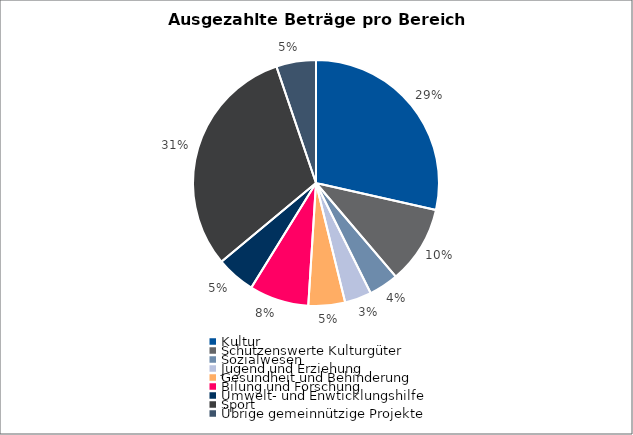
| Category | Series 0 |
|---|---|
| Kultur | 12939000 |
| Schützenswerte Kulturgüter | 4643000 |
| Sozialwesen | 1772000 |
| Jugend und Erziehung | 1595000 |
| Gesundheit und Behinderung | 2187000 |
| Bilung und Forschung | 3545000 |
| Umwelt- und Enwticklungshilfe | 2331000 |
| Sport | 13985000 |
| Übrige gemeinnützige Projekte | 2365000 |